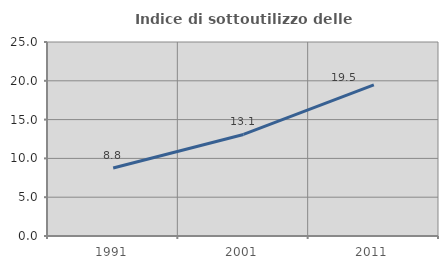
| Category | Indice di sottoutilizzo delle abitazioni  |
|---|---|
| 1991.0 | 8.772 |
| 2001.0 | 13.084 |
| 2011.0 | 19.469 |